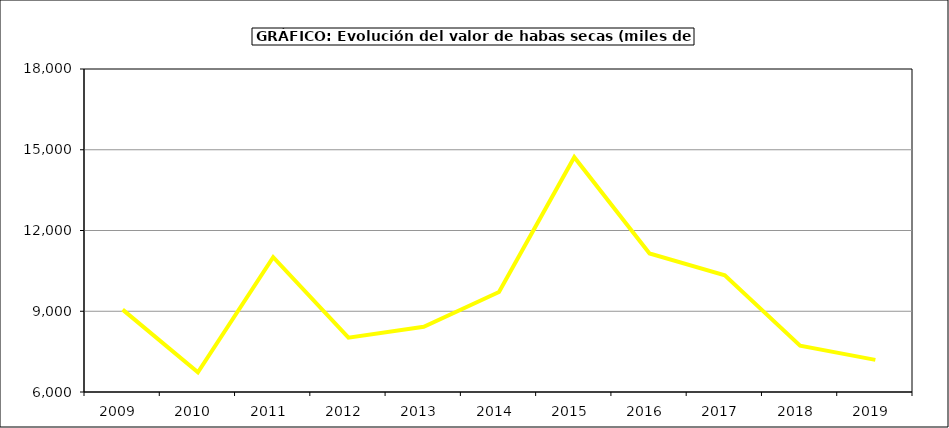
| Category | Valor |
|---|---|
| 2009.0 | 9059.237 |
| 2010.0 | 6730.947 |
| 2011.0 | 11007.809 |
| 2012.0 | 8020.102 |
| 2013.0 | 8422.081 |
| 2014.0 | 9715.78 |
| 2015.0 | 14725 |
| 2016.0 | 11148.6 |
| 2017.0 | 10333.378 |
| 2018.0 | 7717.975 |
| 2019.0 | 7193.25 |